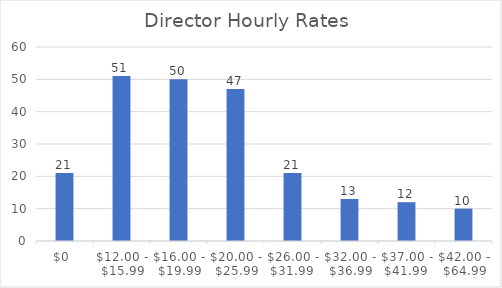
| Category | Series 0 |
|---|---|
| $0  | 21 |
| $12.00 - $15.99 | 51 |
| $16.00 - $19.99 | 50 |
| $20.00 - $25.99 | 47 |
| $26.00 - $31.99  | 21 |
| $32.00 - $36.99 | 13 |
| $37.00 - $41.99  | 12 |
| $42.00 - $64.99 | 10 |